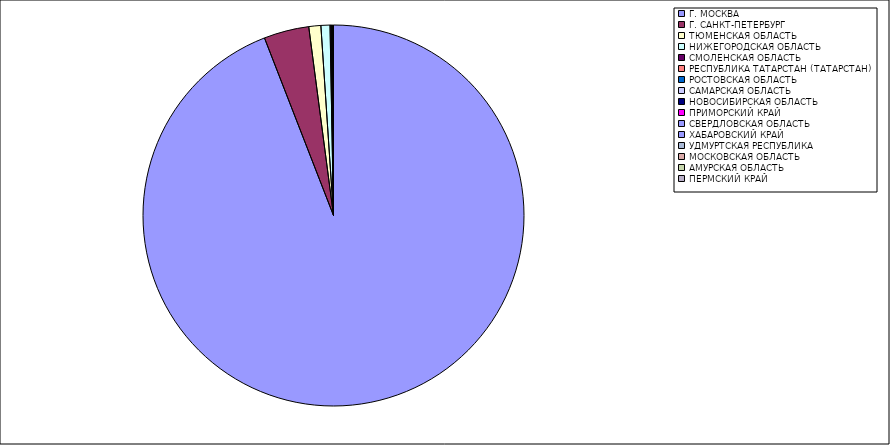
| Category | Оборот |
|---|---|
| Г. МОСКВА | 94.045 |
| Г. САНКТ-ПЕТЕРБУРГ | 3.823 |
| ТЮМЕНСКАЯ ОБЛАСТЬ | 1.019 |
| НИЖЕГОРОДСКАЯ ОБЛАСТЬ | 0.768 |
| СМОЛЕНСКАЯ ОБЛАСТЬ | 0.097 |
| РЕСПУБЛИКА ТАТАРСТАН (ТАТАРСТАН) | 0.048 |
| РОСТОВСКАЯ ОБЛАСТЬ | 0.026 |
| САМАРСКАЯ ОБЛАСТЬ | 0.022 |
| НОВОСИБИРСКАЯ ОБЛАСТЬ | 0.022 |
| ПРИМОРСКИЙ КРАЙ | 0.019 |
| СВЕРДЛОВСКАЯ ОБЛАСТЬ | 0.013 |
| ХАБАРОВСКИЙ КРАЙ | 0.01 |
| УДМУРТСКАЯ РЕСПУБЛИКА | 0.009 |
| МОСКОВСКАЯ ОБЛАСТЬ | 0.009 |
| АМУРСКАЯ ОБЛАСТЬ | 0.008 |
| ПЕРМСКИЙ КРАЙ | 0.006 |